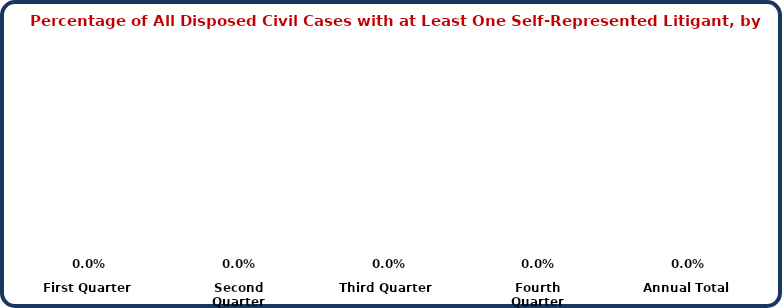
| Category | Civil |
|---|---|
| First Quarter | 0 |
| Second Quarter | 0 |
| Third Quarter | 0 |
| Fourth Quarter | 0 |
| Annual Total | 0 |